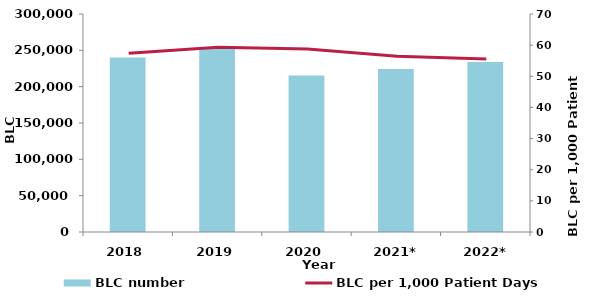
| Category | BLC number |
|---|---|
| 2018 | 240023 |
| 2019 | 253210 |
| 2020 | 215536 |
| 2021* | 224216 |
| 2022* | 233861 |